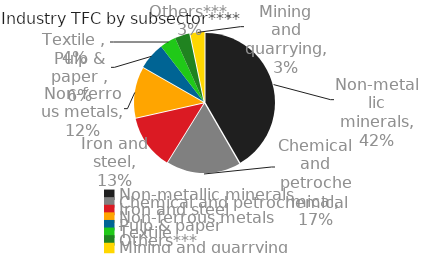
| Category | Industry TFC by subsector**** |
|---|---|
| Non-metallic minerals | 9330.708 |
| Chemical and petrochemical | 3845.562 |
| Iron and steel | 2836.002 |
| Non-ferrous metals | 2642.604 |
| Pulp & paper  | 1412.941 |
| Textile  | 836.323 |
| Others*** | 765.938 |
| Mining and quarrying | 734.227 |